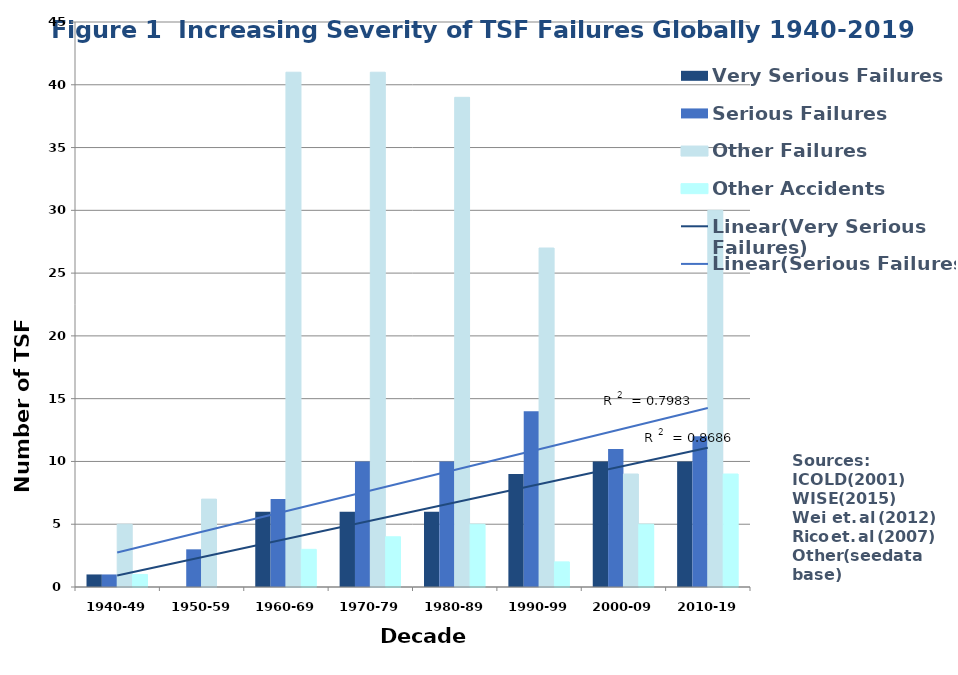
| Category | Very Serious Failures | Serious Failures | Other Failures | Other Accidents |
|---|---|---|---|---|
| 1940-49 | 1 | 1 | 5 | 1 |
| 1950-59 | 0 | 3 | 7 | 0 |
| 1960-69 | 6 | 7 | 41 | 3 |
| 1970-79 | 6 | 10 | 41 | 4 |
| 1980-89 | 6 | 10 | 39 | 5 |
| 1990-99 | 9 | 14 | 27 | 2 |
| 2000-09 | 10 | 11 | 9 | 5 |
| 2010-19 | 10 | 12 | 30 | 9 |